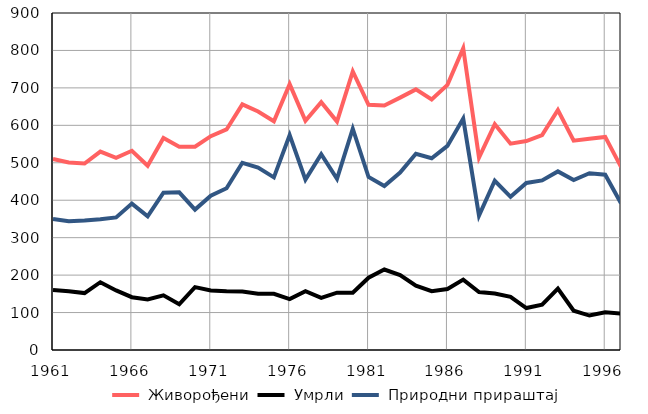
| Category |  Живорођени |  Умрли |  Природни прираштај |
|---|---|---|---|
| 1961.0 | 510 | 160 | 350 |
| 1962.0 | 501 | 157 | 344 |
| 1963.0 | 498 | 152 | 346 |
| 1964.0 | 530 | 181 | 349 |
| 1965.0 | 513 | 159 | 354 |
| 1966.0 | 532 | 141 | 391 |
| 1967.0 | 492 | 135 | 357 |
| 1968.0 | 566 | 146 | 420 |
| 1969.0 | 543 | 122 | 421 |
| 1970.0 | 543 | 168 | 375 |
| 1971.0 | 571 | 159 | 412 |
| 1972.0 | 589 | 157 | 432 |
| 1973.0 | 656 | 156 | 500 |
| 1974.0 | 637 | 150 | 487 |
| 1975.0 | 611 | 150 | 461 |
| 1976.0 | 710 | 136 | 574 |
| 1977.0 | 612 | 157 | 455 |
| 1978.0 | 662 | 139 | 523 |
| 1979.0 | 610 | 153 | 457 |
| 1980.0 | 744 | 153 | 591 |
| 1981.0 | 655 | 193 | 462 |
| 1982.0 | 653 | 215 | 438 |
| 1983.0 | 674 | 200 | 474 |
| 1984.0 | 696 | 172 | 524 |
| 1985.0 | 669 | 157 | 512 |
| 1986.0 | 708 | 163 | 545 |
| 1987.0 | 806 | 188 | 618 |
| 1988.0 | 514 | 155 | 359 |
| 1989.0 | 603 | 151 | 452 |
| 1990.0 | 551 | 142 | 409 |
| 1991.0 | 558 | 112 | 446 |
| 1992.0 | 574 | 121 | 453 |
| 1993.0 | 641 | 164 | 477 |
| 1994.0 | 559 | 105 | 454 |
| 1995.0 | 564 | 92 | 472 |
| 1996.0 | 569 | 101 | 468 |
| 1997.0 | 489 | 97 | 392 |